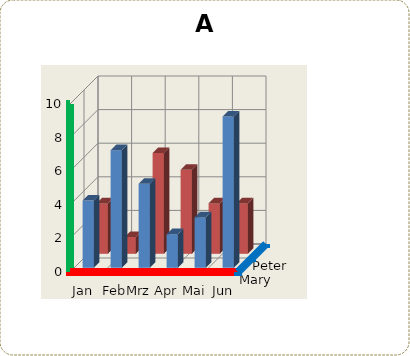
| Category | Mary | Peter |
|---|---|---|
| Jan | 4 | 3 |
| Feb | 7 | 1 |
| Mrz | 5 | 6 |
| Apr | 2 | 5 |
| Mai | 3 | 3 |
| Jun | 9 | 3 |